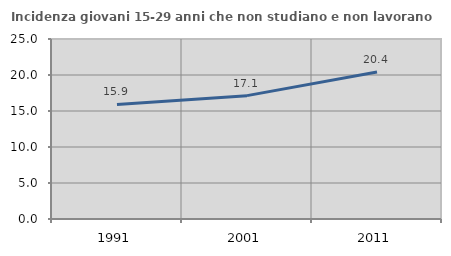
| Category | Incidenza giovani 15-29 anni che non studiano e non lavorano  |
|---|---|
| 1991.0 | 15.909 |
| 2001.0 | 17.133 |
| 2011.0 | 20.426 |